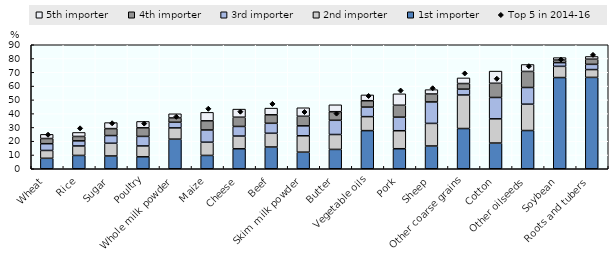
| Category | 1st importer | 2nd importer | 3rd importer | 4th importer | 5th importer |
|---|---|---|---|---|---|
| Wheat | 7.587 | 5.685 | 4.911 | 3.772 | 3.008 |
| Rice | 9.663 | 6.876 | 3.698 | 3.209 | 2.906 |
| Sugar | 9.27 | 9.234 | 5.591 | 5.043 | 4.368 |
| Poultry | 8.657 | 7.908 | 6.92 | 6.225 | 4.638 |
| Whole milk powder | 21.489 | 8.177 | 4.08 | 3.129 | 3.026 |
| Maize | 9.67 | 9.597 | 8.879 | 6.624 | 6.168 |
| Cheese | 14.487 | 9.229 | 6.985 | 6.704 | 5.893 |
| Beef | 15.783 | 9.968 | 7.246 | 6.157 | 4.85 |
| Skim milk powder | 12.036 | 11.899 | 7.197 | 6.972 | 6.166 |
| Butter | 14.038 | 10.812 | 10.328 | 6.23 | 5.015 |
| Vegetable oils | 27.682 | 10.148 | 6.911 | 4.63 | 4.215 |
| Pork | 14.533 | 13.061 | 9.859 | 8.639 | 8.3 |
| Sheep | 16.515 | 16.407 | 15.568 | 5.755 | 3.178 |
| Other coarse grains | 29.194 | 24.358 | 4.22 | 4.091 | 4.064 |
| Cotton | 18.649 | 17.585 | 15.493 | 10.308 | 8.835 |
| Other oilseeds | 27.748 | 19.121 | 12.109 | 11.661 | 5.028 |
| Soybean | 66.191 | 8.146 | 2.68 | 1.871 | 1.771 |
| Roots and tubers | 66.312 | 5.675 | 3.796 | 3.751 | 1.968 |